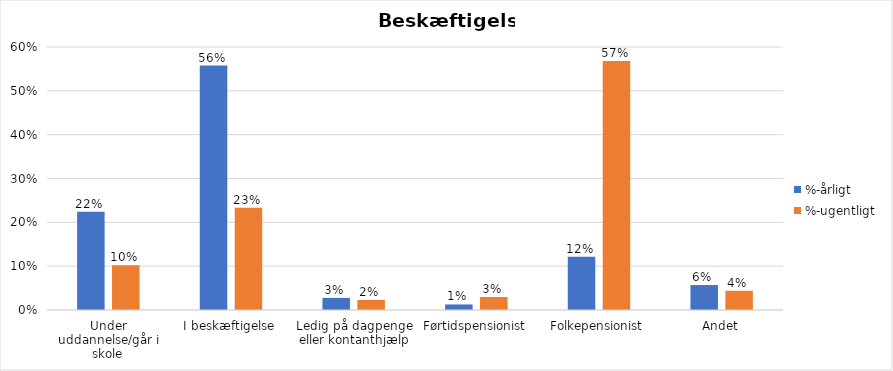
| Category | %-årligt | %-ugentligt |
|---|---|---|
| Under uddannelse/går i skole | 0.224 | 0.102 |
| I beskæftigelse | 0.558 | 0.233 |
| Ledig på dagpenge eller kontanthjælp | 0.028 | 0.023 |
| Førtidspensionist | 0.013 | 0.03 |
| Folkepensionist | 0.121 | 0.568 |
| Andet | 0.057 | 0.044 |